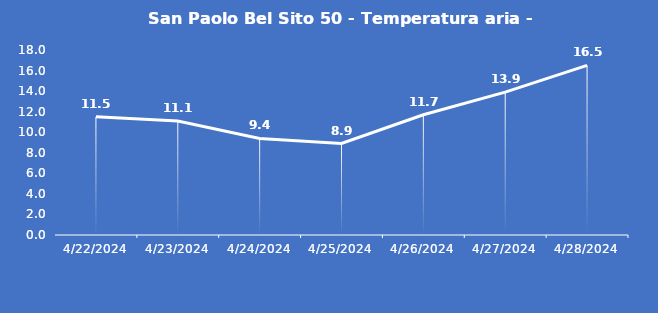
| Category | San Paolo Bel Sito 50 - Temperatura aria - Grezzo (°C) |
|---|---|
| 4/22/24 | 11.5 |
| 4/23/24 | 11.1 |
| 4/24/24 | 9.4 |
| 4/25/24 | 8.9 |
| 4/26/24 | 11.7 |
| 4/27/24 | 13.9 |
| 4/28/24 | 16.5 |